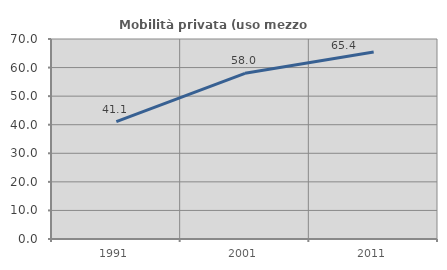
| Category | Mobilità privata (uso mezzo privato) |
|---|---|
| 1991.0 | 41.077 |
| 2001.0 | 57.996 |
| 2011.0 | 65.422 |